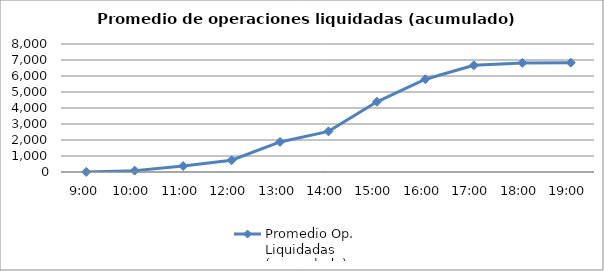
| Category | Promedio Op.
Liquidadas 
(acumulado) |
|---|---|
| 0.375 | 4.55 |
| 0.4166666666666667 | 85.05 |
| 0.4583333333333333 | 370.8 |
| 0.5 | 737.15 |
| 0.5416666666666666 | 1879.25 |
| 0.583333333333333 | 2540.7 |
| 0.625 | 4389.1 |
| 0.666666666666667 | 5800.5 |
| 0.708333333333333 | 6666.45 |
| 0.75 | 6818.15 |
| 0.791666666666667 | 6833.85 |